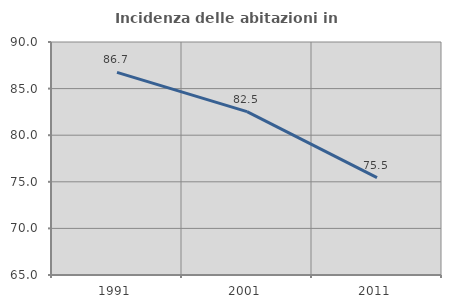
| Category | Incidenza delle abitazioni in proprietà  |
|---|---|
| 1991.0 | 86.735 |
| 2001.0 | 82.524 |
| 2011.0 | 75.455 |